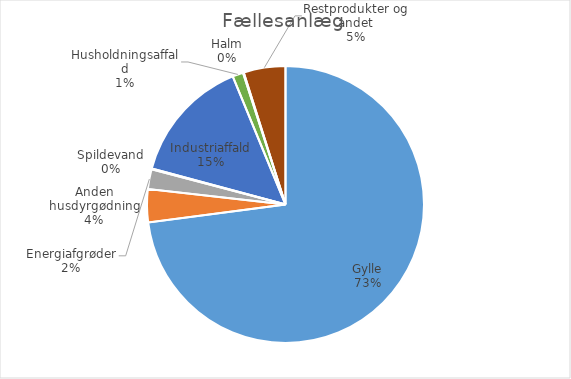
| Category | Series 0 |
|---|---|
| Gylle | 4022834.47 |
| Anden husdyrgødning | 212967.24 |
| Energiafgrøder | 126728.5 |
| Spildevand | 6055.3 |
| Industriaffald | 804774.58 |
| Husholdningsaffald | 68964.13 |
| Halm | 5060 |
| Restprodukter og andet | 268934.13 |